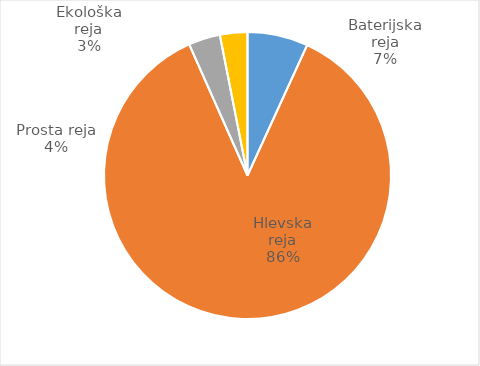
| Category | Količina kosov jajc |
|---|---|
| Baterijska reja | 211070 |
| Hlevska reja | 2674544 |
| Prosta reja | 110235 |
| Ekološka reja | 95700 |